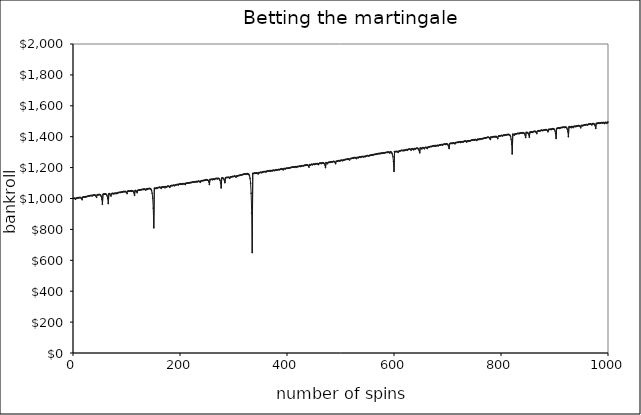
| Category | Series 0 |
|---|---|
| 0 | 1001 |
| 1 | 1002 |
| 2 | 1001 |
| 3 | 999 |
| 4 | 995 |
| 5 | 1003 |
| 6 | 1002 |
| 7 | 1004 |
| 8 | 1005 |
| 9 | 1004 |
| 10 | 1006 |
| 11 | 1005 |
| 12 | 1007 |
| 13 | 1006 |
| 14 | 1004 |
| 15 | 1000 |
| 16 | 992 |
| 17 | 1008 |
| 18 | 1009 |
| 19 | 1010 |
| 20 | 1009 |
| 21 | 1011 |
| 22 | 1010 |
| 23 | 1012 |
| 24 | 1011 |
| 25 | 1013 |
| 26 | 1014 |
| 27 | 1015 |
| 28 | 1016 |
| 29 | 1017 |
| 30 | 1018 |
| 31 | 1019 |
| 32 | 1018 |
| 33 | 1020 |
| 34 | 1019 |
| 35 | 1017 |
| 36 | 1021 |
| 37 | 1022 |
| 38 | 1021 |
| 39 | 1023 |
| 40 | 1022 |
| 41 | 1020 |
| 42 | 1016 |
| 43 | 1008 |
| 44 | 1024 |
| 45 | 1023 |
| 46 | 1025 |
| 47 | 1024 |
| 48 | 1026 |
| 49 | 1025 |
| 50 | 1023 |
| 51 | 1019 |
| 52 | 1011 |
| 53 | 995 |
| 54 | 963 |
| 55 | 1027 |
| 56 | 1028 |
| 57 | 1029 |
| 58 | 1028 |
| 59 | 1030 |
| 60 | 1029 |
| 61 | 1027 |
| 62 | 1023 |
| 63 | 1015 |
| 64 | 999 |
| 65 | 967 |
| 66 | 1031 |
| 67 | 1030 |
| 68 | 1028 |
| 69 | 1024 |
| 70 | 1016 |
| 71 | 1032 |
| 72 | 1031 |
| 73 | 1033 |
| 74 | 1032 |
| 75 | 1030 |
| 76 | 1034 |
| 77 | 1033 |
| 78 | 1031 |
| 79 | 1035 |
| 80 | 1034 |
| 81 | 1032 |
| 82 | 1036 |
| 83 | 1037 |
| 84 | 1038 |
| 85 | 1039 |
| 86 | 1040 |
| 87 | 1039 |
| 88 | 1041 |
| 89 | 1040 |
| 90 | 1042 |
| 91 | 1041 |
| 92 | 1043 |
| 93 | 1044 |
| 94 | 1045 |
| 95 | 1044 |
| 96 | 1046 |
| 97 | 1045 |
| 98 | 1043 |
| 99 | 1039 |
| 100 | 1031 |
| 101 | 1047 |
| 102 | 1048 |
| 103 | 1047 |
| 104 | 1049 |
| 105 | 1048 |
| 106 | 1050 |
| 107 | 1049 |
| 108 | 1047 |
| 109 | 1051 |
| 110 | 1050 |
| 111 | 1048 |
| 112 | 1044 |
| 113 | 1036 |
| 114 | 1020 |
| 115 | 1052 |
| 116 | 1051 |
| 117 | 1049 |
| 118 | 1045 |
| 119 | 1037 |
| 120 | 1053 |
| 121 | 1052 |
| 122 | 1054 |
| 123 | 1055 |
| 124 | 1056 |
| 125 | 1055 |
| 126 | 1057 |
| 127 | 1058 |
| 128 | 1057 |
| 129 | 1059 |
| 130 | 1060 |
| 131 | 1059 |
| 132 | 1061 |
| 133 | 1060 |
| 134 | 1058 |
| 135 | 1054 |
| 136 | 1062 |
| 137 | 1061 |
| 138 | 1059 |
| 139 | 1063 |
| 140 | 1064 |
| 141 | 1063 |
| 142 | 1065 |
| 143 | 1064 |
| 144 | 1062 |
| 145 | 1058 |
| 146 | 1050 |
| 147 | 1034 |
| 148 | 1002 |
| 149 | 938 |
| 150 | 810 |
| 151 | 1066 |
| 152 | 1067 |
| 153 | 1066 |
| 154 | 1064 |
| 155 | 1068 |
| 156 | 1067 |
| 157 | 1069 |
| 158 | 1070 |
| 159 | 1071 |
| 160 | 1072 |
| 161 | 1073 |
| 162 | 1072 |
| 163 | 1070 |
| 164 | 1066 |
| 165 | 1074 |
| 166 | 1073 |
| 167 | 1075 |
| 168 | 1076 |
| 169 | 1075 |
| 170 | 1073 |
| 171 | 1069 |
| 172 | 1077 |
| 173 | 1076 |
| 174 | 1074 |
| 175 | 1078 |
| 176 | 1079 |
| 177 | 1080 |
| 178 | 1079 |
| 179 | 1077 |
| 180 | 1073 |
| 181 | 1081 |
| 182 | 1082 |
| 183 | 1083 |
| 184 | 1084 |
| 185 | 1083 |
| 186 | 1085 |
| 187 | 1086 |
| 188 | 1085 |
| 189 | 1083 |
| 190 | 1087 |
| 191 | 1088 |
| 192 | 1089 |
| 193 | 1090 |
| 194 | 1091 |
| 195 | 1090 |
| 196 | 1088 |
| 197 | 1092 |
| 198 | 1093 |
| 199 | 1094 |
| 200 | 1093 |
| 201 | 1095 |
| 202 | 1094 |
| 203 | 1092 |
| 204 | 1096 |
| 205 | 1095 |
| 206 | 1097 |
| 207 | 1096 |
| 208 | 1094 |
| 209 | 1090 |
| 210 | 1098 |
| 211 | 1099 |
| 212 | 1100 |
| 213 | 1099 |
| 214 | 1101 |
| 215 | 1100 |
| 216 | 1102 |
| 217 | 1101 |
| 218 | 1103 |
| 219 | 1104 |
| 220 | 1103 |
| 221 | 1105 |
| 222 | 1106 |
| 223 | 1105 |
| 224 | 1107 |
| 225 | 1106 |
| 226 | 1108 |
| 227 | 1109 |
| 228 | 1108 |
| 229 | 1110 |
| 230 | 1109 |
| 231 | 1107 |
| 232 | 1111 |
| 233 | 1110 |
| 234 | 1112 |
| 235 | 1111 |
| 236 | 1109 |
| 237 | 1105 |
| 238 | 1113 |
| 239 | 1114 |
| 240 | 1115 |
| 241 | 1116 |
| 242 | 1115 |
| 243 | 1117 |
| 244 | 1116 |
| 245 | 1118 |
| 246 | 1119 |
| 247 | 1120 |
| 248 | 1121 |
| 249 | 1122 |
| 250 | 1121 |
| 251 | 1119 |
| 252 | 1115 |
| 253 | 1107 |
| 254 | 1091 |
| 255 | 1123 |
| 256 | 1122 |
| 257 | 1124 |
| 258 | 1125 |
| 259 | 1124 |
| 260 | 1122 |
| 261 | 1126 |
| 262 | 1125 |
| 263 | 1123 |
| 264 | 1127 |
| 265 | 1128 |
| 266 | 1129 |
| 267 | 1130 |
| 268 | 1129 |
| 269 | 1127 |
| 270 | 1131 |
| 271 | 1130 |
| 272 | 1128 |
| 273 | 1124 |
| 274 | 1116 |
| 275 | 1100 |
| 276 | 1068 |
| 277 | 1132 |
| 278 | 1133 |
| 279 | 1132 |
| 280 | 1130 |
| 281 | 1126 |
| 282 | 1118 |
| 283 | 1102 |
| 284 | 1134 |
| 285 | 1135 |
| 286 | 1136 |
| 287 | 1137 |
| 288 | 1136 |
| 289 | 1138 |
| 290 | 1137 |
| 291 | 1135 |
| 292 | 1131 |
| 293 | 1139 |
| 294 | 1140 |
| 295 | 1141 |
| 296 | 1140 |
| 297 | 1142 |
| 298 | 1143 |
| 299 | 1142 |
| 300 | 1144 |
| 301 | 1145 |
| 302 | 1144 |
| 303 | 1142 |
| 304 | 1138 |
| 305 | 1146 |
| 306 | 1145 |
| 307 | 1147 |
| 308 | 1148 |
| 309 | 1149 |
| 310 | 1150 |
| 311 | 1149 |
| 312 | 1151 |
| 313 | 1152 |
| 314 | 1153 |
| 315 | 1154 |
| 316 | 1155 |
| 317 | 1156 |
| 318 | 1157 |
| 319 | 1158 |
| 320 | 1159 |
| 321 | 1158 |
| 322 | 1160 |
| 323 | 1159 |
| 324 | 1157 |
| 325 | 1161 |
| 326 | 1160 |
| 327 | 1158 |
| 328 | 1154 |
| 329 | 1146 |
| 330 | 1130 |
| 331 | 1098 |
| 332 | 1034 |
| 333 | 906 |
| 334 | 650 |
| 335 | 1162 |
| 336 | 1163 |
| 337 | 1162 |
| 338 | 1164 |
| 339 | 1165 |
| 340 | 1164 |
| 341 | 1162 |
| 342 | 1166 |
| 343 | 1165 |
| 344 | 1163 |
| 345 | 1159 |
| 346 | 1167 |
| 347 | 1166 |
| 348 | 1168 |
| 349 | 1169 |
| 350 | 1170 |
| 351 | 1169 |
| 352 | 1167 |
| 353 | 1171 |
| 354 | 1172 |
| 355 | 1173 |
| 356 | 1174 |
| 357 | 1173 |
| 358 | 1175 |
| 359 | 1174 |
| 360 | 1172 |
| 361 | 1176 |
| 362 | 1177 |
| 363 | 1178 |
| 364 | 1179 |
| 365 | 1178 |
| 366 | 1180 |
| 367 | 1179 |
| 368 | 1177 |
| 369 | 1181 |
| 370 | 1180 |
| 371 | 1178 |
| 372 | 1182 |
| 373 | 1181 |
| 374 | 1183 |
| 375 | 1182 |
| 376 | 1180 |
| 377 | 1184 |
| 378 | 1185 |
| 379 | 1184 |
| 380 | 1186 |
| 381 | 1185 |
| 382 | 1187 |
| 383 | 1188 |
| 384 | 1187 |
| 385 | 1185 |
| 386 | 1189 |
| 387 | 1190 |
| 388 | 1191 |
| 389 | 1192 |
| 390 | 1191 |
| 391 | 1189 |
| 392 | 1185 |
| 393 | 1193 |
| 394 | 1194 |
| 395 | 1193 |
| 396 | 1191 |
| 397 | 1195 |
| 398 | 1196 |
| 399 | 1195 |
| 400 | 1197 |
| 401 | 1196 |
| 402 | 1198 |
| 403 | 1197 |
| 404 | 1199 |
| 405 | 1200 |
| 406 | 1199 |
| 407 | 1201 |
| 408 | 1202 |
| 409 | 1203 |
| 410 | 1204 |
| 411 | 1203 |
| 412 | 1205 |
| 413 | 1204 |
| 414 | 1202 |
| 415 | 1206 |
| 416 | 1205 |
| 417 | 1203 |
| 418 | 1207 |
| 419 | 1206 |
| 420 | 1208 |
| 421 | 1207 |
| 422 | 1209 |
| 423 | 1210 |
| 424 | 1209 |
| 425 | 1207 |
| 426 | 1211 |
| 427 | 1212 |
| 428 | 1213 |
| 429 | 1212 |
| 430 | 1210 |
| 431 | 1214 |
| 432 | 1215 |
| 433 | 1216 |
| 434 | 1215 |
| 435 | 1217 |
| 436 | 1218 |
| 437 | 1217 |
| 438 | 1215 |
| 439 | 1211 |
| 440 | 1203 |
| 441 | 1219 |
| 442 | 1218 |
| 443 | 1216 |
| 444 | 1220 |
| 445 | 1221 |
| 446 | 1220 |
| 447 | 1218 |
| 448 | 1222 |
| 449 | 1223 |
| 450 | 1222 |
| 451 | 1220 |
| 452 | 1224 |
| 453 | 1225 |
| 454 | 1224 |
| 455 | 1226 |
| 456 | 1225 |
| 457 | 1223 |
| 458 | 1219 |
| 459 | 1227 |
| 460 | 1228 |
| 461 | 1229 |
| 462 | 1228 |
| 463 | 1226 |
| 464 | 1230 |
| 465 | 1229 |
| 466 | 1231 |
| 467 | 1230 |
| 468 | 1228 |
| 469 | 1224 |
| 470 | 1216 |
| 471 | 1200 |
| 472 | 1232 |
| 473 | 1231 |
| 474 | 1229 |
| 475 | 1225 |
| 476 | 1233 |
| 477 | 1234 |
| 478 | 1235 |
| 479 | 1234 |
| 480 | 1236 |
| 481 | 1235 |
| 482 | 1237 |
| 483 | 1238 |
| 484 | 1237 |
| 485 | 1239 |
| 486 | 1240 |
| 487 | 1239 |
| 488 | 1237 |
| 489 | 1233 |
| 490 | 1225 |
| 491 | 1241 |
| 492 | 1240 |
| 493 | 1242 |
| 494 | 1243 |
| 495 | 1244 |
| 496 | 1245 |
| 497 | 1244 |
| 498 | 1242 |
| 499 | 1246 |
| 500 | 1247 |
| 501 | 1248 |
| 502 | 1247 |
| 503 | 1245 |
| 504 | 1249 |
| 505 | 1248 |
| 506 | 1250 |
| 507 | 1251 |
| 508 | 1252 |
| 509 | 1253 |
| 510 | 1254 |
| 511 | 1253 |
| 512 | 1255 |
| 513 | 1256 |
| 514 | 1255 |
| 515 | 1253 |
| 516 | 1249 |
| 517 | 1257 |
| 518 | 1258 |
| 519 | 1259 |
| 520 | 1260 |
| 521 | 1261 |
| 522 | 1262 |
| 523 | 1261 |
| 524 | 1263 |
| 525 | 1264 |
| 526 | 1265 |
| 527 | 1264 |
| 528 | 1262 |
| 529 | 1258 |
| 530 | 1266 |
| 531 | 1265 |
| 532 | 1263 |
| 533 | 1267 |
| 534 | 1268 |
| 535 | 1269 |
| 536 | 1268 |
| 537 | 1266 |
| 538 | 1270 |
| 539 | 1271 |
| 540 | 1272 |
| 541 | 1271 |
| 542 | 1269 |
| 543 | 1273 |
| 544 | 1272 |
| 545 | 1270 |
| 546 | 1274 |
| 547 | 1275 |
| 548 | 1276 |
| 549 | 1277 |
| 550 | 1278 |
| 551 | 1277 |
| 552 | 1275 |
| 553 | 1279 |
| 554 | 1278 |
| 555 | 1280 |
| 556 | 1281 |
| 557 | 1282 |
| 558 | 1281 |
| 559 | 1283 |
| 560 | 1282 |
| 561 | 1284 |
| 562 | 1285 |
| 563 | 1286 |
| 564 | 1285 |
| 565 | 1287 |
| 566 | 1288 |
| 567 | 1287 |
| 568 | 1289 |
| 569 | 1290 |
| 570 | 1291 |
| 571 | 1292 |
| 572 | 1291 |
| 573 | 1289 |
| 574 | 1293 |
| 575 | 1292 |
| 576 | 1294 |
| 577 | 1293 |
| 578 | 1295 |
| 579 | 1294 |
| 580 | 1296 |
| 581 | 1295 |
| 582 | 1297 |
| 583 | 1296 |
| 584 | 1298 |
| 585 | 1299 |
| 586 | 1298 |
| 587 | 1300 |
| 588 | 1301 |
| 589 | 1300 |
| 590 | 1298 |
| 591 | 1294 |
| 592 | 1302 |
| 593 | 1301 |
| 594 | 1299 |
| 595 | 1295 |
| 596 | 1287 |
| 597 | 1271 |
| 598 | 1239 |
| 599 | 1175 |
| 600 | 1303 |
| 601 | 1302 |
| 602 | 1304 |
| 603 | 1303 |
| 604 | 1305 |
| 605 | 1304 |
| 606 | 1302 |
| 607 | 1298 |
| 608 | 1306 |
| 609 | 1307 |
| 610 | 1308 |
| 611 | 1309 |
| 612 | 1310 |
| 613 | 1311 |
| 614 | 1312 |
| 615 | 1311 |
| 616 | 1309 |
| 617 | 1313 |
| 618 | 1312 |
| 619 | 1310 |
| 620 | 1314 |
| 621 | 1315 |
| 622 | 1316 |
| 623 | 1315 |
| 624 | 1313 |
| 625 | 1317 |
| 626 | 1318 |
| 627 | 1319 |
| 628 | 1320 |
| 629 | 1319 |
| 630 | 1317 |
| 631 | 1313 |
| 632 | 1321 |
| 633 | 1322 |
| 634 | 1321 |
| 635 | 1319 |
| 636 | 1315 |
| 637 | 1323 |
| 638 | 1322 |
| 639 | 1320 |
| 640 | 1324 |
| 641 | 1325 |
| 642 | 1326 |
| 643 | 1325 |
| 644 | 1323 |
| 645 | 1319 |
| 646 | 1311 |
| 647 | 1295 |
| 648 | 1327 |
| 649 | 1326 |
| 650 | 1324 |
| 651 | 1320 |
| 652 | 1328 |
| 653 | 1329 |
| 654 | 1328 |
| 655 | 1326 |
| 656 | 1322 |
| 657 | 1330 |
| 658 | 1331 |
| 659 | 1330 |
| 660 | 1328 |
| 661 | 1324 |
| 662 | 1332 |
| 663 | 1331 |
| 664 | 1333 |
| 665 | 1334 |
| 666 | 1335 |
| 667 | 1336 |
| 668 | 1337 |
| 669 | 1336 |
| 670 | 1338 |
| 671 | 1339 |
| 672 | 1340 |
| 673 | 1341 |
| 674 | 1342 |
| 675 | 1341 |
| 676 | 1339 |
| 677 | 1343 |
| 678 | 1342 |
| 679 | 1340 |
| 680 | 1344 |
| 681 | 1343 |
| 682 | 1341 |
| 683 | 1345 |
| 684 | 1346 |
| 685 | 1347 |
| 686 | 1346 |
| 687 | 1348 |
| 688 | 1349 |
| 689 | 1348 |
| 690 | 1346 |
| 691 | 1350 |
| 692 | 1351 |
| 693 | 1352 |
| 694 | 1353 |
| 695 | 1352 |
| 696 | 1350 |
| 697 | 1354 |
| 698 | 1353 |
| 699 | 1351 |
| 700 | 1347 |
| 701 | 1339 |
| 702 | 1323 |
| 703 | 1355 |
| 704 | 1356 |
| 705 | 1357 |
| 706 | 1358 |
| 707 | 1357 |
| 708 | 1355 |
| 709 | 1359 |
| 710 | 1360 |
| 711 | 1359 |
| 712 | 1357 |
| 713 | 1353 |
| 714 | 1361 |
| 715 | 1362 |
| 716 | 1363 |
| 717 | 1362 |
| 718 | 1364 |
| 719 | 1363 |
| 720 | 1365 |
| 721 | 1366 |
| 722 | 1365 |
| 723 | 1363 |
| 724 | 1367 |
| 725 | 1366 |
| 726 | 1368 |
| 727 | 1367 |
| 728 | 1365 |
| 729 | 1369 |
| 730 | 1370 |
| 731 | 1371 |
| 732 | 1372 |
| 733 | 1371 |
| 734 | 1369 |
| 735 | 1365 |
| 736 | 1373 |
| 737 | 1372 |
| 738 | 1370 |
| 739 | 1374 |
| 740 | 1373 |
| 741 | 1371 |
| 742 | 1375 |
| 743 | 1376 |
| 744 | 1377 |
| 745 | 1378 |
| 746 | 1379 |
| 747 | 1380 |
| 748 | 1379 |
| 749 | 1377 |
| 750 | 1381 |
| 751 | 1382 |
| 752 | 1381 |
| 753 | 1379 |
| 754 | 1375 |
| 755 | 1383 |
| 756 | 1384 |
| 757 | 1383 |
| 758 | 1381 |
| 759 | 1385 |
| 760 | 1384 |
| 761 | 1386 |
| 762 | 1387 |
| 763 | 1386 |
| 764 | 1388 |
| 765 | 1387 |
| 766 | 1389 |
| 767 | 1390 |
| 768 | 1391 |
| 769 | 1392 |
| 770 | 1391 |
| 771 | 1393 |
| 772 | 1394 |
| 773 | 1395 |
| 774 | 1396 |
| 775 | 1397 |
| 776 | 1396 |
| 777 | 1394 |
| 778 | 1390 |
| 779 | 1382 |
| 780 | 1398 |
| 781 | 1397 |
| 782 | 1395 |
| 783 | 1399 |
| 784 | 1400 |
| 785 | 1399 |
| 786 | 1401 |
| 787 | 1400 |
| 788 | 1398 |
| 789 | 1402 |
| 790 | 1401 |
| 791 | 1399 |
| 792 | 1395 |
| 793 | 1387 |
| 794 | 1403 |
| 795 | 1404 |
| 796 | 1405 |
| 797 | 1404 |
| 798 | 1406 |
| 799 | 1407 |
| 800 | 1408 |
| 801 | 1407 |
| 802 | 1405 |
| 803 | 1409 |
| 804 | 1410 |
| 805 | 1409 |
| 806 | 1411 |
| 807 | 1412 |
| 808 | 1411 |
| 809 | 1413 |
| 810 | 1412 |
| 811 | 1414 |
| 812 | 1413 |
| 813 | 1415 |
| 814 | 1414 |
| 815 | 1412 |
| 816 | 1408 |
| 817 | 1400 |
| 818 | 1384 |
| 819 | 1352 |
| 820 | 1288 |
| 821 | 1416 |
| 822 | 1415 |
| 823 | 1413 |
| 824 | 1409 |
| 825 | 1417 |
| 826 | 1418 |
| 827 | 1419 |
| 828 | 1418 |
| 829 | 1420 |
| 830 | 1421 |
| 831 | 1422 |
| 832 | 1421 |
| 833 | 1419 |
| 834 | 1423 |
| 835 | 1424 |
| 836 | 1423 |
| 837 | 1425 |
| 838 | 1424 |
| 839 | 1422 |
| 840 | 1426 |
| 841 | 1425 |
| 842 | 1423 |
| 843 | 1419 |
| 844 | 1411 |
| 845 | 1395 |
| 846 | 1427 |
| 847 | 1428 |
| 848 | 1427 |
| 849 | 1425 |
| 850 | 1421 |
| 851 | 1413 |
| 852 | 1397 |
| 853 | 1429 |
| 854 | 1430 |
| 855 | 1429 |
| 856 | 1431 |
| 857 | 1430 |
| 858 | 1428 |
| 859 | 1432 |
| 860 | 1433 |
| 861 | 1434 |
| 862 | 1435 |
| 863 | 1434 |
| 864 | 1432 |
| 865 | 1428 |
| 866 | 1420 |
| 867 | 1436 |
| 868 | 1437 |
| 869 | 1438 |
| 870 | 1439 |
| 871 | 1438 |
| 872 | 1436 |
| 873 | 1440 |
| 874 | 1441 |
| 875 | 1442 |
| 876 | 1441 |
| 877 | 1439 |
| 878 | 1443 |
| 879 | 1442 |
| 880 | 1444 |
| 881 | 1443 |
| 882 | 1445 |
| 883 | 1446 |
| 884 | 1445 |
| 885 | 1443 |
| 886 | 1439 |
| 887 | 1431 |
| 888 | 1447 |
| 889 | 1448 |
| 890 | 1447 |
| 891 | 1449 |
| 892 | 1448 |
| 893 | 1446 |
| 894 | 1450 |
| 895 | 1451 |
| 896 | 1452 |
| 897 | 1451 |
| 898 | 1449 |
| 899 | 1445 |
| 900 | 1437 |
| 901 | 1421 |
| 902 | 1389 |
| 903 | 1453 |
| 904 | 1454 |
| 905 | 1455 |
| 906 | 1456 |
| 907 | 1457 |
| 908 | 1456 |
| 909 | 1454 |
| 910 | 1458 |
| 911 | 1459 |
| 912 | 1460 |
| 913 | 1459 |
| 914 | 1461 |
| 915 | 1460 |
| 916 | 1462 |
| 917 | 1461 |
| 918 | 1459 |
| 919 | 1463 |
| 920 | 1462 |
| 921 | 1460 |
| 922 | 1456 |
| 923 | 1448 |
| 924 | 1432 |
| 925 | 1400 |
| 926 | 1464 |
| 927 | 1465 |
| 928 | 1464 |
| 929 | 1462 |
| 930 | 1458 |
| 931 | 1466 |
| 932 | 1465 |
| 933 | 1463 |
| 934 | 1459 |
| 935 | 1467 |
| 936 | 1466 |
| 937 | 1468 |
| 938 | 1467 |
| 939 | 1465 |
| 940 | 1469 |
| 941 | 1470 |
| 942 | 1469 |
| 943 | 1471 |
| 944 | 1472 |
| 945 | 1471 |
| 946 | 1469 |
| 947 | 1465 |
| 948 | 1457 |
| 949 | 1473 |
| 950 | 1472 |
| 951 | 1470 |
| 952 | 1474 |
| 953 | 1473 |
| 954 | 1475 |
| 955 | 1476 |
| 956 | 1475 |
| 957 | 1477 |
| 958 | 1478 |
| 959 | 1479 |
| 960 | 1478 |
| 961 | 1476 |
| 962 | 1480 |
| 963 | 1481 |
| 964 | 1482 |
| 965 | 1481 |
| 966 | 1483 |
| 967 | 1482 |
| 968 | 1480 |
| 969 | 1476 |
| 970 | 1484 |
| 971 | 1485 |
| 972 | 1484 |
| 973 | 1482 |
| 974 | 1478 |
| 975 | 1470 |
| 976 | 1454 |
| 977 | 1486 |
| 978 | 1485 |
| 979 | 1487 |
| 980 | 1486 |
| 981 | 1488 |
| 982 | 1489 |
| 983 | 1488 |
| 984 | 1486 |
| 985 | 1490 |
| 986 | 1489 |
| 987 | 1491 |
| 988 | 1490 |
| 989 | 1488 |
| 990 | 1492 |
| 991 | 1491 |
| 992 | 1489 |
| 993 | 1485 |
| 994 | 1493 |
| 995 | 1492 |
| 996 | 1490 |
| 997 | 1486 |
| 998 | 1494 |
| 999 | 1495 |